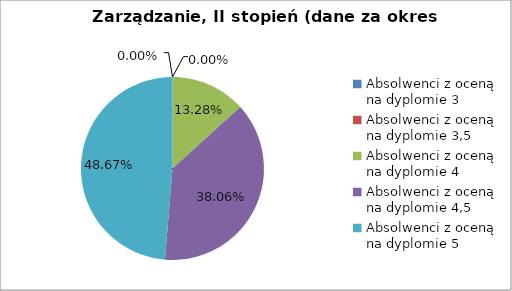
| Category | Series 0 |
|---|---|
| Absolwenci z oceną na dyplomie 3 | 0 |
| Absolwenci z oceną na dyplomie 3,5 | 0 |
| Absolwenci z oceną na dyplomie 4 | 13.274 |
| Absolwenci z oceną na dyplomie 4,5 | 38.053 |
| Absolwenci z oceną na dyplomie 5 | 48.673 |